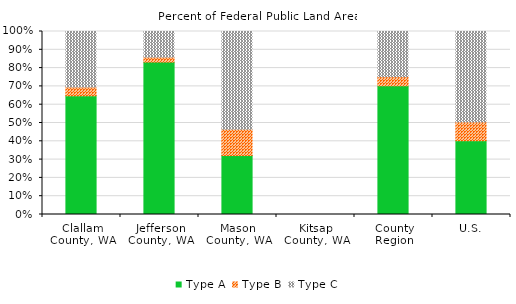
| Category | Type A | Type B | Type C |
|---|---|---|---|
| Clallam County, WA | 0.649 | 0.048 | 0.303 |
| Jefferson County, WA | 0.833 | 0.027 | 0.14 |
| Mason County, WA | 0.322 | 0.144 | 0.534 |
| Kitsap County, WA | 0 | 0 | 0 |
| County Region | 0.703 | 0.049 | 0.248 |
| U.S. | 0.403 | 0.103 | 0.494 |